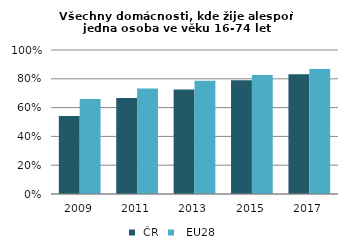
| Category |  ČR |   EU28 |
|---|---|---|
| 2009.0 | 0.542 | 0.659 |
| 2011.0 | 0.666 | 0.732 |
| 2013.0 | 0.726 | 0.786 |
| 2015.0 | 0.79 | 0.826 |
| 2017.0 | 0.832 | 0.869 |